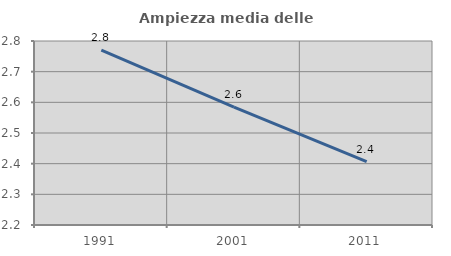
| Category | Ampiezza media delle famiglie |
|---|---|
| 1991.0 | 2.77 |
| 2001.0 | 2.584 |
| 2011.0 | 2.406 |